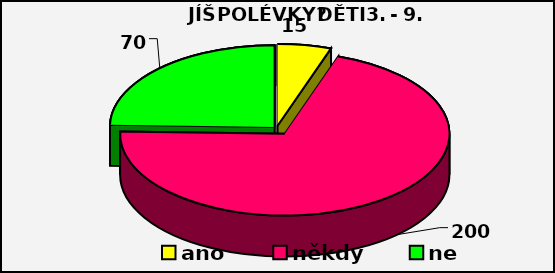
| Category | Series 0 |
|---|---|
| ano | 15 |
| někdy | 200 |
| ne | 70 |